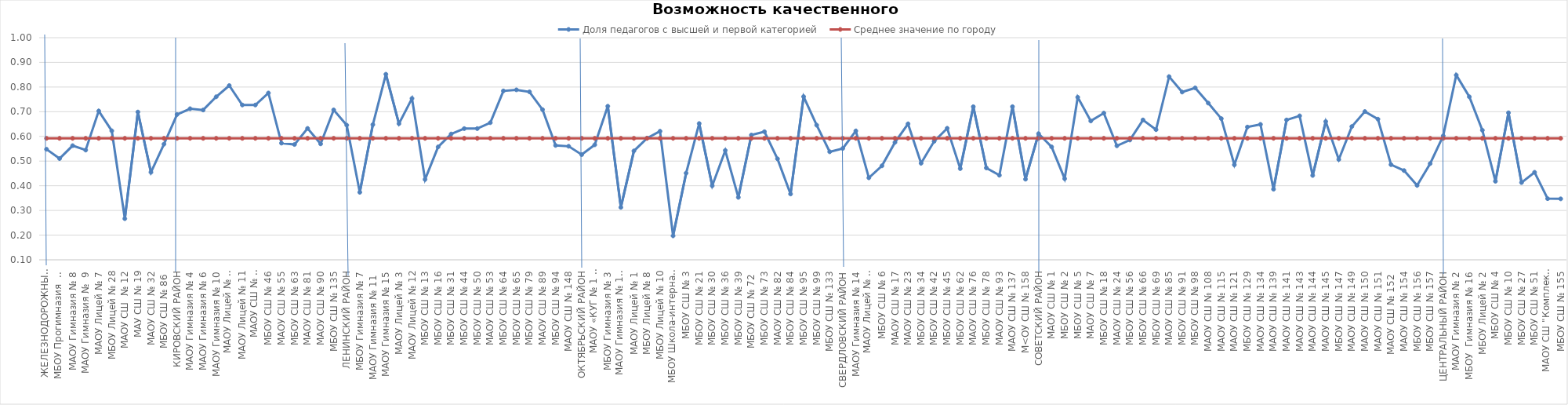
| Category | Доля педагогов с высшей и первой категорией | Среднее значение по городу |
|---|---|---|
| ЖЕЛЕЗНОДОРОЖНЫЙ РАЙОН | 0.548 | 0.592 |
| МБОУ Прогимназия  № 131 | 0.51 | 0.592 |
| МАОУ Гимназия № 8 | 0.562 | 0.592 |
| МАОУ Гимназия №  9 | 0.545 | 0.592 |
| МАОУ Лицей № 7 | 0.703 | 0.592 |
| МБОУ Лицей № 28 | 0.623 | 0.592 |
| МАОУ СШ  № 12 | 0.267 | 0.592 |
| МАУ СШ № 19 | 0.699 | 0.592 |
| МАОУ СШ № 32 | 0.455 | 0.592 |
| МБОУ СШ № 86  | 0.569 | 0.592 |
| КИРОВСКИЙ РАЙОН | 0.689 | 0.592 |
| МАОУ Гимназия № 4 | 0.712 | 0.592 |
| МАОУ Гимназия № 6 | 0.707 | 0.592 |
| МАОУ Гимназия № 10 | 0.761 | 0.592 |
| МАОУ Лицей № 6 "Перспектива" | 0.806 | 0.592 |
| МАОУ Лицей № 11 | 0.727 | 0.592 |
| МАОУ СШ № 8 "Созидание" | 0.727 | 0.592 |
| МБОУ СШ № 46 | 0.776 | 0.592 |
| МАОУ СШ № 55 | 0.573 | 0.592 |
| МБОУ СШ № 63 | 0.567 | 0.592 |
| МАОУ СШ № 81 | 0.632 | 0.592 |
| МАОУ СШ № 90 | 0.57 | 0.592 |
| МБОУ СШ № 135 | 0.707 | 0.592 |
| ЛЕНИНСКИЙ РАЙОН | 0.646 | 0.592 |
| МБОУ Гимназия № 7 | 0.373 | 0.592 |
| МАОУ Гимназия № 11  | 0.648 | 0.592 |
| МАОУ Гимназия № 15 | 0.852 | 0.592 |
| МАОУ Лицей № 3 | 0.652 | 0.592 |
| МАОУ Лицей № 12 | 0.754 | 0.592 |
| МБОУ СШ № 13 | 0.426 | 0.592 |
| МБОУ СШ № 16 | 0.557 | 0.592 |
| МБОУ СШ № 31 | 0.61 | 0.592 |
| МБОУ СШ № 44 | 0.632 | 0.592 |
| МБОУ СШ № 50 | 0.632 | 0.592 |
| МАОУ СШ № 53 | 0.656 | 0.592 |
| МБОУ СШ № 64 | 0.784 | 0.592 |
| МБОУ СШ № 65 | 0.789 | 0.592 |
| МБОУ СШ № 79 | 0.78 | 0.592 |
| МАОУ СШ № 89 | 0.708 | 0.592 |
| МБОУ СШ № 94 | 0.563 | 0.592 |
| МАОУ СШ № 148 | 0.56 | 0.592 |
| ОКТЯБРЬСКИЙ РАЙОН | 0.526 | 0.592 |
| МАОУ «КУГ № 1 – Универс» | 0.566 | 0.592 |
| МБОУ Гимназия № 3 | 0.722 | 0.592 |
| МАОУ Гимназия № 13 "Академ" | 0.312 | 0.592 |
| МАОУ Лицей № 1 | 0.541 | 0.592 |
| МБОУ Лицей № 8 | 0.593 | 0.592 |
| МБОУ Лицей № 10 | 0.621 | 0.592 |
| МБОУ Школа-интернат № 1 | 0.197 | 0.592 |
| МБОУ СШ № 3 | 0.451 | 0.592 |
| МБОУ СШ № 21 | 0.652 | 0.592 |
| МБОУ СШ № 30 | 0.4 | 0.592 |
| МБОУ СШ № 36 | 0.543 | 0.592 |
| МБОУ СШ № 39 | 0.353 | 0.592 |
| МБОУ СШ № 72  | 0.606 | 0.592 |
| МБОУ СШ № 73 | 0.619 | 0.592 |
| МАОУ СШ № 82 | 0.509 | 0.592 |
| МБОУ СШ № 84 | 0.367 | 0.592 |
| МБОУ СШ № 95 | 0.761 | 0.592 |
| МБОУ СШ № 99 | 0.646 | 0.592 |
| МБОУ СШ № 133 | 0.538 | 0.592 |
| СВЕРДЛОВСКИЙ РАЙОН | 0.551 | 0.592 |
| МАОУ Гимназия № 14 | 0.622 | 0.592 |
| МАОУ Лицей № 9 "Лидер" | 0.432 | 0.592 |
| МБОУ СШ № 6 | 0.481 | 0.592 |
| МАОУ СШ № 17 | 0.576 | 0.592 |
| МАОУ СШ № 23 | 0.651 | 0.592 |
| МБОУ СШ № 34 | 0.491 | 0.592 |
| МБОУ СШ № 42 | 0.58 | 0.592 |
| МБОУ СШ № 45 | 0.633 | 0.592 |
| МБОУ СШ № 62 | 0.469 | 0.592 |
| МАОУ СШ № 76 | 0.72 | 0.592 |
| МБОУ СШ № 78 | 0.472 | 0.592 |
| МАОУ СШ № 93 | 0.443 | 0.592 |
| МАОУ СШ № 137 | 0.721 | 0.592 |
| М<ОУ СШ № 158 | 0.427 | 0.592 |
| СОВЕТСКИЙ РАЙОН | 0.611 | 0.592 |
| МАОУ СШ № 1 | 0.557 | 0.592 |
| МБОУ СШ № 2 | 0.429 | 0.592 |
| МБОУ СШ № 5 | 0.759 | 0.592 |
| МАОУ СШ № 7 | 0.662 | 0.592 |
| МБОУ СШ № 18 | 0.694 | 0.592 |
| МАОУ СШ № 24 | 0.562 | 0.592 |
| МБОУ СШ № 56 | 0.585 | 0.592 |
| МБОУ СШ № 66 | 0.667 | 0.592 |
| МБОУ СШ № 69 | 0.627 | 0.592 |
| МАОУ СШ № 85 | 0.842 | 0.592 |
| МБОУ СШ № 91 | 0.78 | 0.592 |
| МБОУ СШ № 98 | 0.797 | 0.592 |
| МАОУ СШ № 108 | 0.735 | 0.592 |
| МАОУ СШ № 115 | 0.672 | 0.592 |
| МАОУ СШ № 121 | 0.485 | 0.592 |
| МБОУ СШ № 129 | 0.638 | 0.592 |
| МАОУ СШ № 134 | 0.649 | 0.592 |
| МАОУ СШ № 139 | 0.386 | 0.592 |
| МАОУ СШ № 141 | 0.667 | 0.592 |
| МАОУ СШ № 143 | 0.683 | 0.592 |
| МАОУ СШ № 144 | 0.442 | 0.592 |
| МАОУ СШ № 145 | 0.66 | 0.592 |
| МБОУ СШ № 147 | 0.506 | 0.592 |
| МАОУ СШ № 149 | 0.64 | 0.592 |
| МАОУ СШ № 150 | 0.701 | 0.592 |
| МАОУ СШ № 151 | 0.67 | 0.592 |
| МАОУ СШ № 152  | 0.486 | 0.592 |
| МАОУ СШ № 154 | 0.462 | 0.592 |
| МБОУ СШ № 156 | 0.401 | 0.592 |
| МБОУ СШ № 157 | 0.49 | 0.592 |
| ЦЕНТРАЛЬНЫЙ РАЙОН | 0.602 | 0.592 |
| МАОУ Гимназия № 2 | 0.848 | 0.592 |
| МБОУ  Гимназия № 16 | 0.761 | 0.592 |
| МБОУ Лицей № 2 | 0.625 | 0.592 |
| МБОУ СШ № 4 | 0.418 | 0.592 |
| МБОУ СШ № 10 | 0.696 | 0.592 |
| МБОУ СШ № 27 | 0.413 | 0.592 |
| МБОУ СШ № 51 | 0.455 | 0.592 |
| МАОУ СШ "Комплекс "Покровский" | 0.348 | 0.592 |
| МБОУ СШ № 155 | 0.347 | 0.592 |